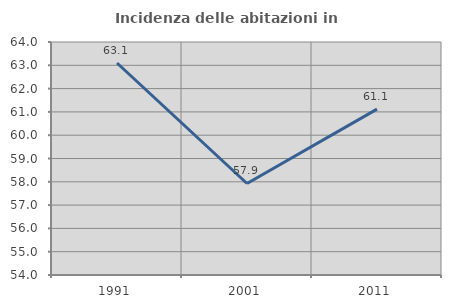
| Category | Incidenza delle abitazioni in proprietà  |
|---|---|
| 1991.0 | 63.099 |
| 2001.0 | 57.928 |
| 2011.0 | 61.118 |